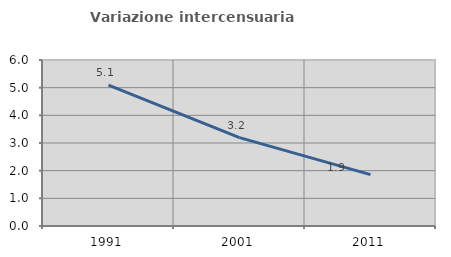
| Category | Variazione intercensuaria annua |
|---|---|
| 1991.0 | 5.092 |
| 2001.0 | 3.195 |
| 2011.0 | 1.857 |